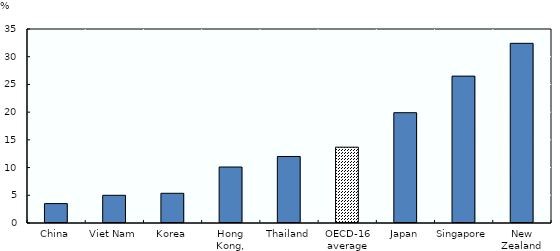
| Category | % |
|---|---|
| China | 3.5 |
| Viet Nam | 5 |
| Korea | 5.359 |
| Hong Kong, China | 10.1 |
| Thailand | 12 |
| OECD-16 average (c) | 13.676 |
| Japan | 19.9 |
| Singapore | 26.5 |
| New Zealand | 32.413 |